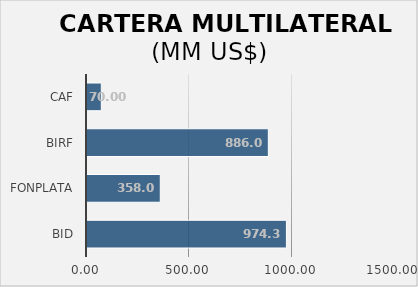
| Category | Series 0 |
|---|---|
| BID | 974.3 |
| FONPLATA | 358.064 |
| BIRF | 886 |
| CAF | 70 |